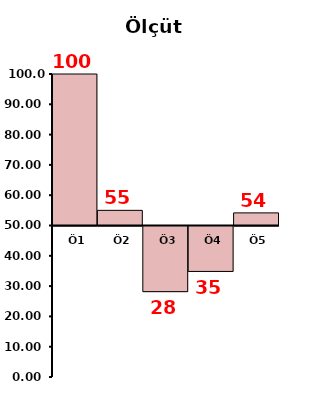
| Category | Series 0 |
|---|---|
| Ö1 | 100 |
| Ö2 | 55 |
| Ö3 | 28.333 |
| Ö4 | 35 |
| Ö5 | 54.167 |